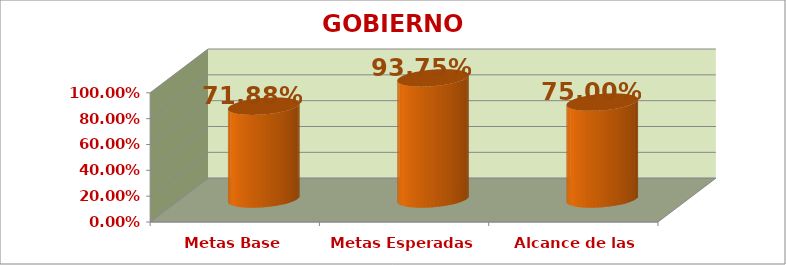
| Category | GOBIERNO ESCOLAR |
|---|---|
| Metas Base | 0.719 |
| Metas Esperadas | 0.938 |
| Alcance de las Metas | 0.75 |